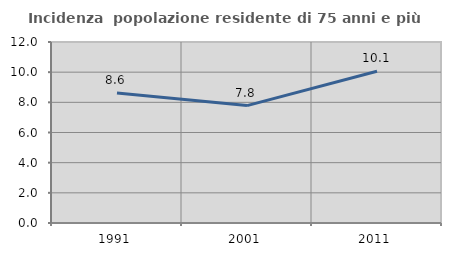
| Category | Incidenza  popolazione residente di 75 anni e più |
|---|---|
| 1991.0 | 8.619 |
| 2001.0 | 7.784 |
| 2011.0 | 10.057 |